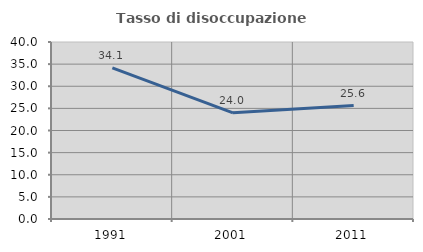
| Category | Tasso di disoccupazione giovanile  |
|---|---|
| 1991.0 | 34.146 |
| 2001.0 | 24 |
| 2011.0 | 25.641 |